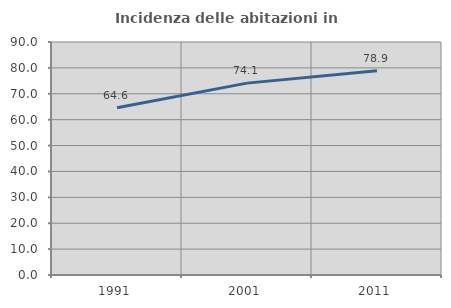
| Category | Incidenza delle abitazioni in proprietà  |
|---|---|
| 1991.0 | 64.629 |
| 2001.0 | 74.116 |
| 2011.0 | 78.936 |